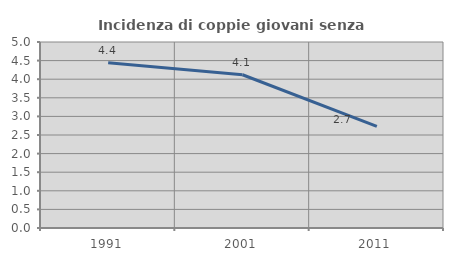
| Category | Incidenza di coppie giovani senza figli |
|---|---|
| 1991.0 | 4.439 |
| 2001.0 | 4.12 |
| 2011.0 | 2.731 |